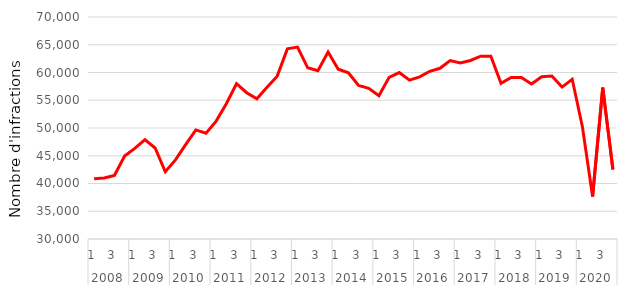
| Category | Série CVS-CJO |
|---|---|
| 0 | 40858.211 |
| 1 | 40978.929 |
| 2 | 41461.185 |
| 3 | 44955.527 |
| 4 | 46324.441 |
| 5 | 47901.66 |
| 6 | 46396.186 |
| 7 | 42111.298 |
| 8 | 44261.267 |
| 9 | 47018.286 |
| 10 | 49649.586 |
| 11 | 49058.159 |
| 12 | 51243.724 |
| 13 | 54370.959 |
| 14 | 57980.333 |
| 15 | 56354.284 |
| 16 | 55266.578 |
| 17 | 57324.992 |
| 18 | 59344.857 |
| 19 | 64256.225 |
| 20 | 64580.761 |
| 21 | 60847.201 |
| 22 | 60337.18 |
| 23 | 63685.895 |
| 24 | 60581.729 |
| 25 | 59942.284 |
| 26 | 57647.711 |
| 27 | 57138.207 |
| 28 | 55808.567 |
| 29 | 59130.554 |
| 30 | 59992.216 |
| 31 | 58625.236 |
| 32 | 59213.596 |
| 33 | 60217.152 |
| 34 | 60755.447 |
| 35 | 62145.332 |
| 36 | 61738.489 |
| 37 | 62169.797 |
| 38 | 62948.488 |
| 39 | 62917.828 |
| 40 | 58051.516 |
| 41 | 59117.956 |
| 42 | 59082.379 |
| 43 | 57938.233 |
| 44 | 59246.919 |
| 45 | 59367.284 |
| 46 | 57373.398 |
| 47 | 58776.933 |
| 48 | 50244.603 |
| 49 | 37651.511 |
| 50 | 57267.287 |
| 51 | 42512.338 |